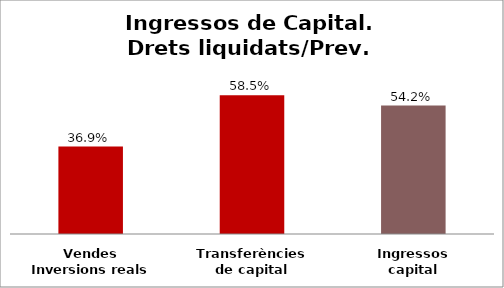
| Category | Series 0 |
|---|---|
| Vendes Inversions reals | 0.369 |
| Transferències de capital | 0.585 |
| Ingressos capital | 0.542 |